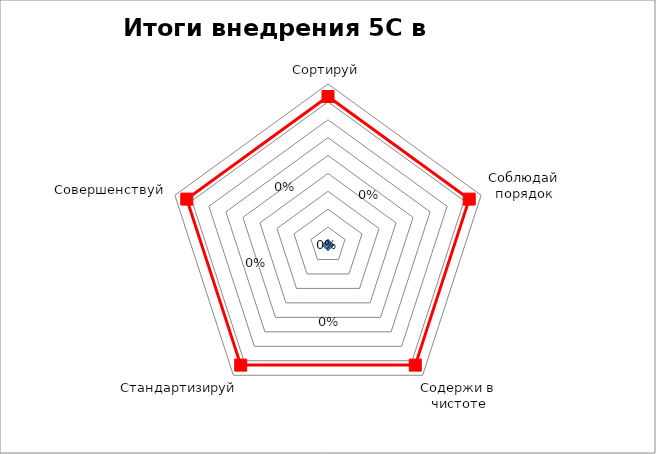
| Category | Series 0 | Успех Успех Успех Успех Успех |
|---|---|---|
| Сортируй | 0 | 0.83 |
| Соблюдай порядок | 0 | 0.83 |
| Содержи в чистоте | 0 | 0.83 |
| Стандартизируй | 0 | 0.83 |
| Совершенствуй | 0 | 0.83 |